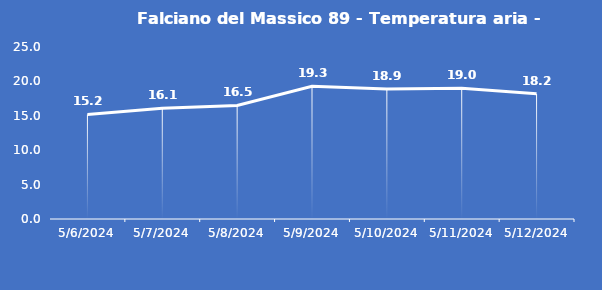
| Category | Falciano del Massico 89 - Temperatura aria - Grezzo (°C) |
|---|---|
| 5/6/24 | 15.2 |
| 5/7/24 | 16.1 |
| 5/8/24 | 16.5 |
| 5/9/24 | 19.3 |
| 5/10/24 | 18.9 |
| 5/11/24 | 19 |
| 5/12/24 | 18.2 |